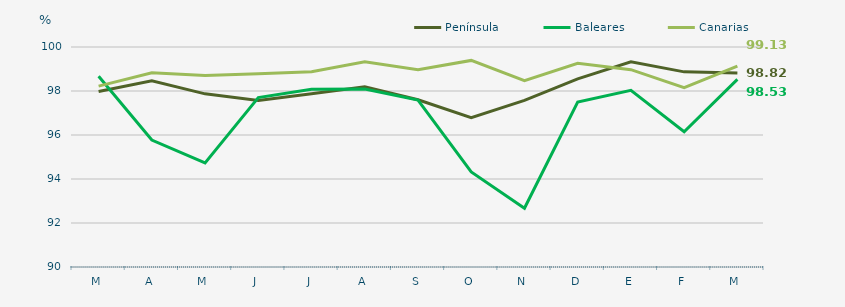
| Category | Península | Baleares | Canarias |
|---|---|---|---|
| M | 97.98 | 98.67 | 98.22 |
| A | 98.46 | 95.77 | 98.83 |
| M | 97.87 | 94.73 | 98.7 |
| J | 97.57 | 97.7 | 98.78 |
| J | 97.87 | 98.08 | 98.88 |
| A | 98.19 | 98.09 | 99.33 |
| S | 97.6 | 97.59 | 98.97 |
| O | 96.79 | 94.32 | 99.39 |
| N | 97.57 | 92.67 | 98.47 |
| D | 98.55 | 97.5 | 99.26 |
| E | 99.33 | 98.03 | 98.97 |
| F | 98.87 | 96.15 | 98.15 |
| M | 98.82 | 98.53 | 99.13 |